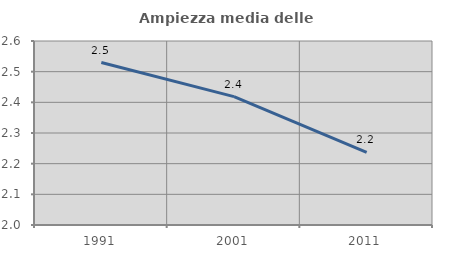
| Category | Ampiezza media delle famiglie |
|---|---|
| 1991.0 | 2.53 |
| 2001.0 | 2.419 |
| 2011.0 | 2.237 |